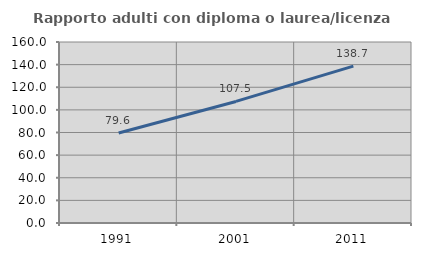
| Category | Rapporto adulti con diploma o laurea/licenza media  |
|---|---|
| 1991.0 | 79.551 |
| 2001.0 | 107.461 |
| 2011.0 | 138.653 |